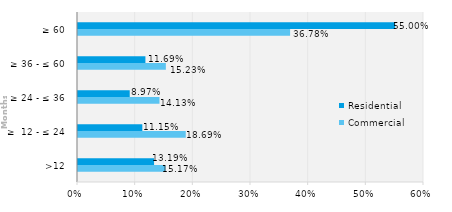
| Category | Commercial | Residential |
|---|---|---|
| >12 | 0.152 | 0.132 |
| ≥  12 - ≤ 24 | 0.187 | 0.112 |
| ≥ 24 - ≤ 36 | 0.141 | 0.09 |
| ≥ 36 - ≤ 60 | 0.152 | 0.117 |
| ≥ 60 | 0.368 | 0.55 |